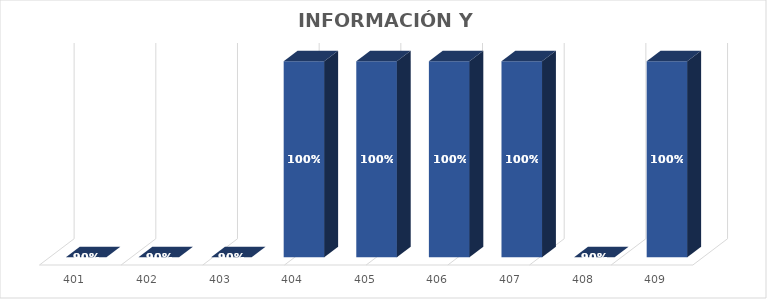
| Category | % Avance |
|---|---|
| 401.0 | 0.9 |
| 402.0 | 0.9 |
| 403.0 | 0.9 |
| 404.0 | 1 |
| 405.0 | 1 |
| 406.0 | 1 |
| 407.0 | 1 |
| 408.0 | 0.9 |
| 409.0 | 1 |